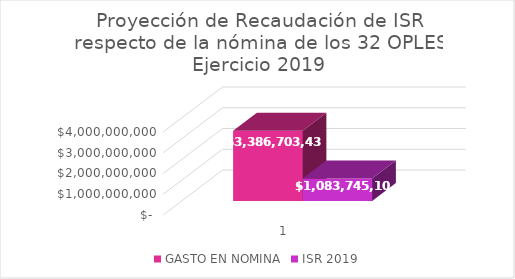
| Category | GASTO EN NOMINA | ISR 2019 |
|---|---|---|
| 0 | 3386703437.46 | 1083745099.987 |